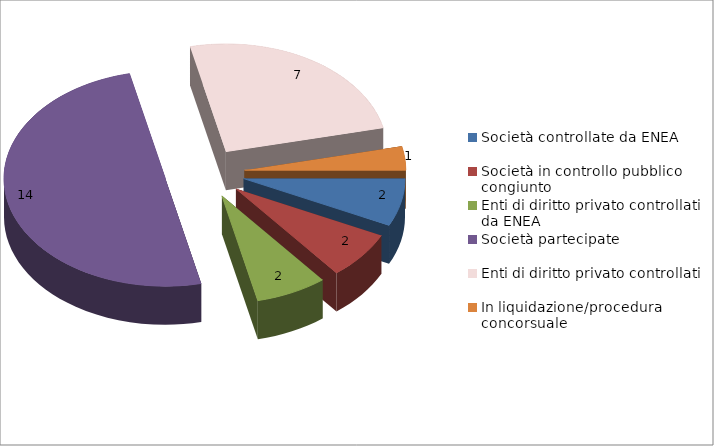
| Category | Series 0 |
|---|---|
| Società controllate da ENEA | 2 |
| Società in controllo pubblico congiunto | 2 |
| Enti di diritto privato controllati da ENEA | 2 |
| Società partecipate | 14 |
| Enti di diritto privato controllati  | 7 |
| In liquidazione/procedura concorsuale | 1 |